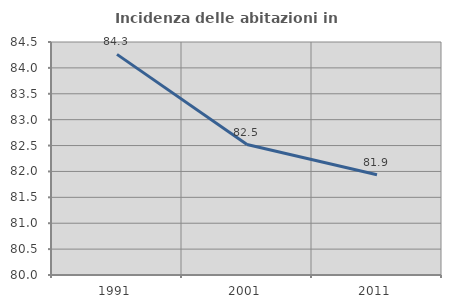
| Category | Incidenza delle abitazioni in proprietà  |
|---|---|
| 1991.0 | 84.261 |
| 2001.0 | 82.519 |
| 2011.0 | 81.935 |